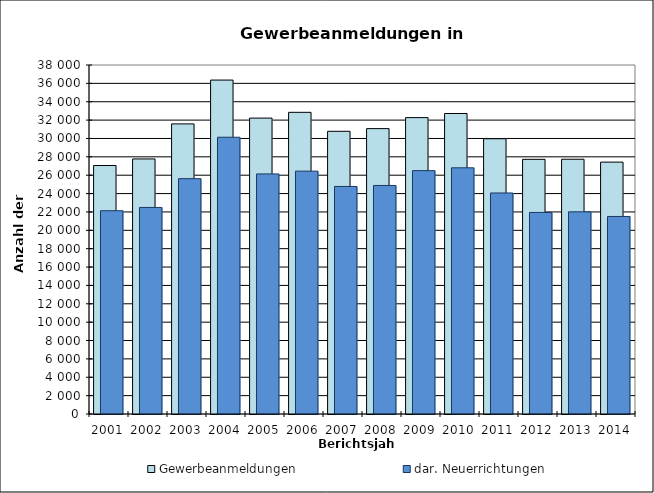
| Category | Gewerbeanmeldungen | dar. Neuerrichtungen |
|---|---|---|
| 2001.0 | 27056 | 22133 |
| 2002.0 | 27771 | 22491 |
| 2003.0 | 31587 | 25624 |
| 2004.0 | 36359 | 30135 |
| 2005.0 | 32219 | 26140 |
| 2006.0 | 32847 | 26444 |
| 2007.0 | 30781 | 24775 |
| 2008.0 | 31074 | 24884 |
| 2009.0 | 32271 | 26499 |
| 2010.0 | 32718 | 26806 |
| 2011.0 | 29971 | 24066 |
| 2012.0 | 27728 | 21948 |
| 2013.0 | 27739 | 22013 |
| 2014.0 | 27426 | 21509 |